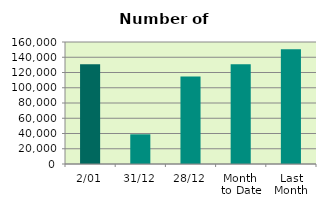
| Category | Series 0 |
|---|---|
| 2/01 | 130844 |
| 31/12 | 38936 |
| 28/12 | 114880 |
| Month 
to Date | 130844 |
| Last
Month | 150628.737 |